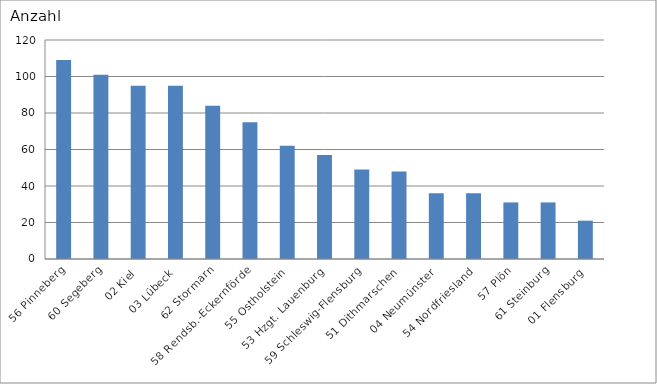
| Category | 56 Pinneberg 60 Segeberg 02 Kiel 03 Lübeck 62 Stormarn 58 Rendsb.-Eckernförde 55 Ostholstein 53 Hzgt. Lauenburg 59 Schleswig-Flensburg 51 Dithmarschen 04 Neumünster 54 Nordfriesland 57 Plön 61 Steinburg 01 Flensburg |
|---|---|
| 56 Pinneberg | 109 |
| 60 Segeberg | 101 |
| 02 Kiel | 95 |
| 03 Lübeck | 95 |
| 62 Stormarn | 84 |
| 58 Rendsb.-Eckernförde | 75 |
| 55 Ostholstein | 62 |
| 53 Hzgt. Lauenburg | 57 |
| 59 Schleswig-Flensburg | 49 |
| 51 Dithmarschen | 48 |
| 04 Neumünster | 36 |
| 54 Nordfriesland | 36 |
| 57 Plön | 31 |
| 61 Steinburg | 31 |
| 01 Flensburg | 21 |